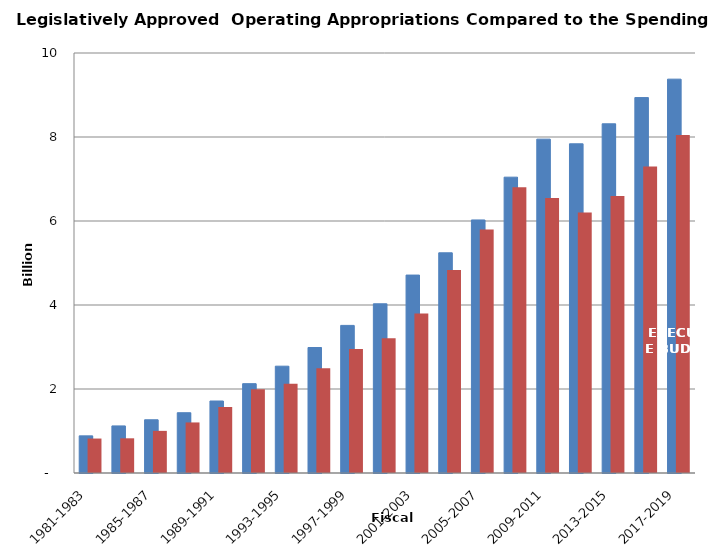
| Category | Spending Cap | Actual Exp |
|---|---|---|
| 1981-1983 | 884473087.093 | 820364155 |
| 1983-1985 | 1120551601.827 | 826105014 |
| 1985-1987 | 1267306050.773 | 1003213421 |
| 1987-1989 | 1435107787.221 | 1203713280 |
| 1989-1991 | 1713979614.536 | 1572882967 |
| 1991-1993 | 2127001671.306 | 1996582365 |
| 1993-1995 | 2543492778.515 | 2126703943 |
| 1995-1997 | 2987960719.556 | 2492715422 |
| 1997-1999 | 3514421012.628 | 2953659473 |
| 1999-2001 | 4028935956.915 | 3206385429 |
| 2001-2003 | 4712752238.004 | 3796284440 |
| 2003-2005 | 5242628213.348 | 4834867448 |
| 2005-2007 | 6025048894.255 | 5797914444 |
| 2007-2009 | 7043611769.068 | 6802121408 |
| 2009-2011 | 7949250845.819 | 6548441906 |
| 2011-2013 | 7838113908.325 | 6204610073 |
| 2013-2015 | 8314269732.578 | 6596067221 |
| 2015-2017 | 8938825863.75 | 7296769113 |
| 2017-2019 | 9377543764.457 | 8045473776 |